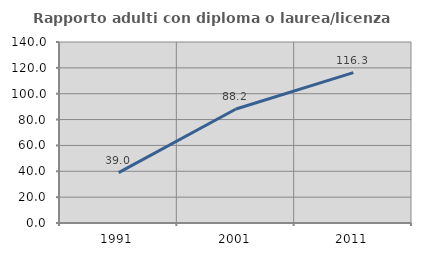
| Category | Rapporto adulti con diploma o laurea/licenza media  |
|---|---|
| 1991.0 | 38.967 |
| 2001.0 | 88.177 |
| 2011.0 | 116.337 |